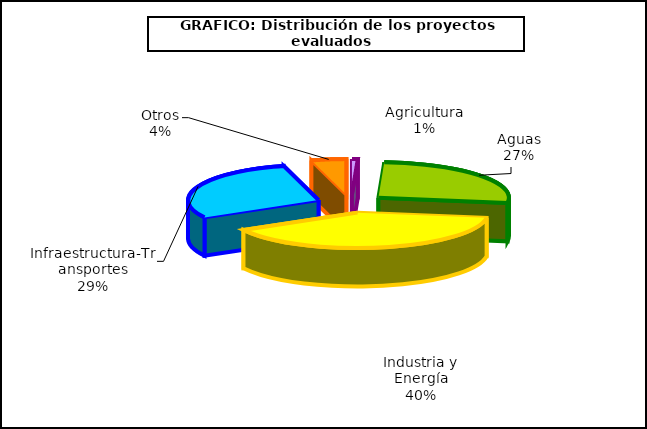
| Category | Series 0 |
|---|---|
| 0 | 1 |
| 1 | 37 |
| 2 | 55 |
| 3 | 40 |
| 4 | 6 |